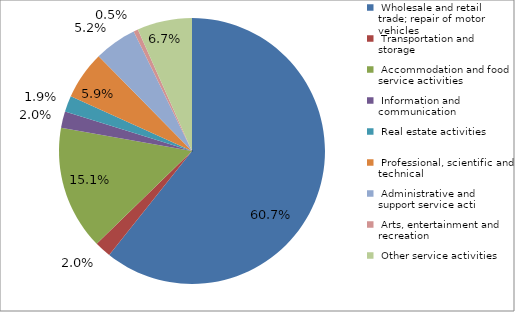
| Category | Enterprises  |  Employees |
|---|---|---|
|  Wholesale and retail trade; repair of motor vehicles  | 0.607 | 20650.4 |
|  Transportation and storage  | 0.02 | 5565.6 |
|  Accommodation and food service activities  | 0.151 | 13076.2 |
|  Information and communication  | 0.02 | 2164.1 |
|  Real estate activities  | 0.019 | 1437.2 |
|  Professional, scientific and technical  | 0.059 | 2482 |
|  Administrative and support service acti  | 0.052 | 22196 |
|  Arts, entertainment and recreation  | 0.005 | 1157.2 |
|  Other service activities  | 0.067 | 3025.7 |